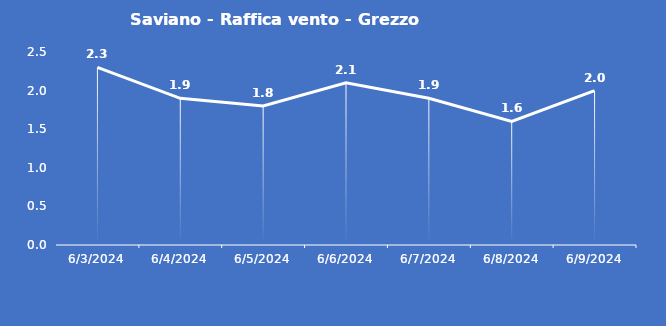
| Category | Saviano - Raffica vento - Grezzo (m/s) |
|---|---|
| 6/3/24 | 2.3 |
| 6/4/24 | 1.9 |
| 6/5/24 | 1.8 |
| 6/6/24 | 2.1 |
| 6/7/24 | 1.9 |
| 6/8/24 | 1.6 |
| 6/9/24 | 2 |